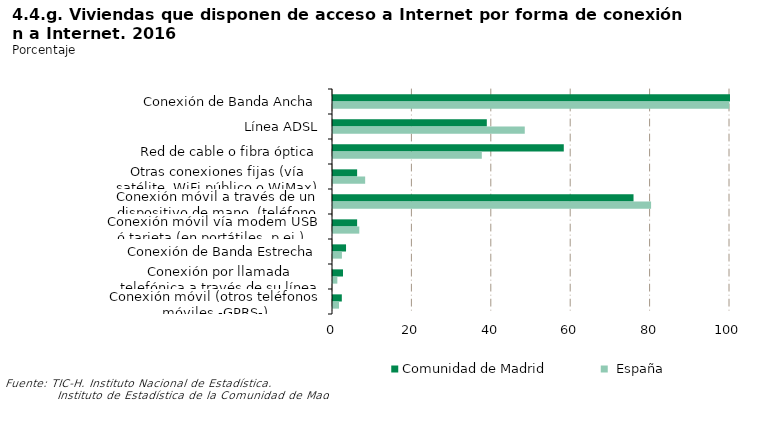
| Category | Comunidad de Madrid | España |
|---|---|---|
| Conexión de Banda Ancha | 100 | 99.825 |
| Línea ADSL | 38.746 | 48.304 |
| Red de cable o fibra óptica | 58.133 | 37.484 |
| Otras conexiones fijas (vía satélite, WiFi público o WiMax) | 6.077 | 8.101 |
| Conexión móvil a través de un dispositivo de mano  (teléfono móvil de últimas generaciones -al menos 3G-, iPod,...) | 75.698 | 80.123 |
| Conexión móvil vía modem USB ó tarjeta (en portátiles, p.ej.) | 6.077 | 6.625 |
| Conexión de Banda Estrecha | 3.284 | 2.245 |
| Conexión por llamada telefónica a través de su línea de teléfono convencional (módem) o RDSI | 2.514 | 1.092 |
| Conexión móvil (otros teléfonos móviles -GPRS-) | 2.221 | 1.507 |